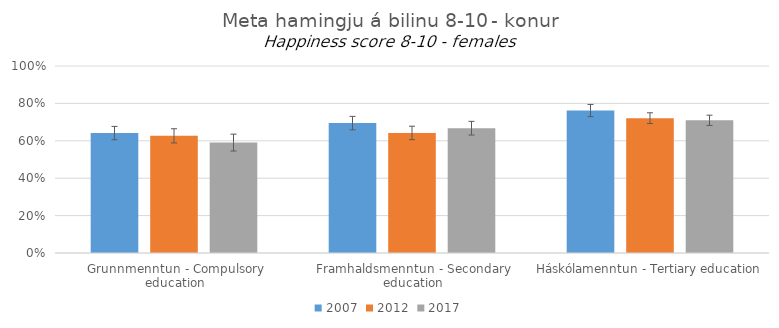
| Category | 2007 | 2012 | 2017 |
|---|---|---|---|
| Grunnmenntun - Compulsory education | 0.641 | 0.626 | 0.59 |
| Framhaldsmenntun - Secondary education | 0.695 | 0.642 | 0.667 |
| Háskólamenntun - Tertiary education | 0.762 | 0.721 | 0.71 |